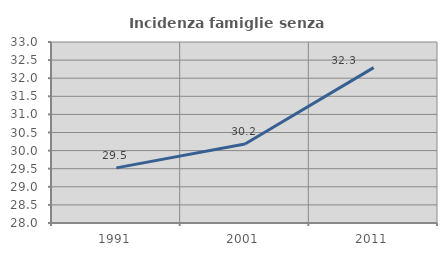
| Category | Incidenza famiglie senza nuclei |
|---|---|
| 1991.0 | 29.523 |
| 2001.0 | 30.181 |
| 2011.0 | 32.293 |